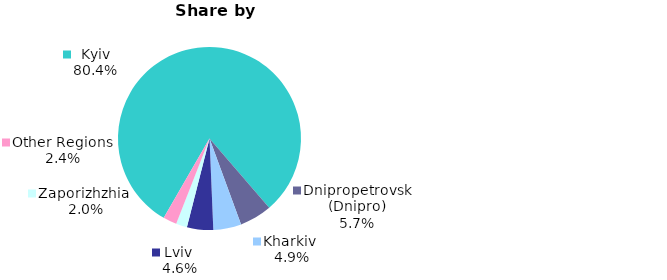
| Category | Series 0 |
|---|---|
| Kyiv | 0.804 |
| Dnipropetrovsk (Dnipro) | 0.057 |
| Kharkiv  | 0.049 |
| Lviv  | 0.046 |
| Zaporizhzhia  | 0.02 |
| Other Regions | 0.024 |